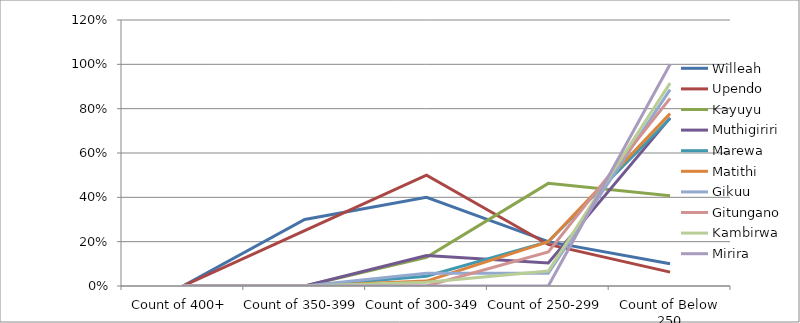
| Category | Willeah | Upendo | Kayuyu | Muthigiriri | Marewa | Matithi | Gikuu | Gitungano | Kambirwa | Mirira |
|---|---|---|---|---|---|---|---|---|---|---|
| Count of 400+ | 0 | 0 | 0 | 0 | 0 | 0 | 0 | 0 | 0 | 0 |
| Count of 350-399 | 0.3 | 0.25 | 0 | 0 | 0 | 0 | 0 | 0 | 0 | 0 |
| Count of 300-349 | 0.4 | 0.5 | 0.13 | 0.138 | 0.044 | 0.022 | 0.057 | 0 | 0.017 | 0 |
| Count of 250-299 | 0.2 | 0.188 | 0.463 | 0.103 | 0.2 | 0.2 | 0.057 | 0.154 | 0.068 | 0 |
| Count of Below 250 | 0.1 | 0.062 | 0.407 | 0.759 | 0.756 | 0.778 | 0.886 | 0.846 | 0.915 | 1 |